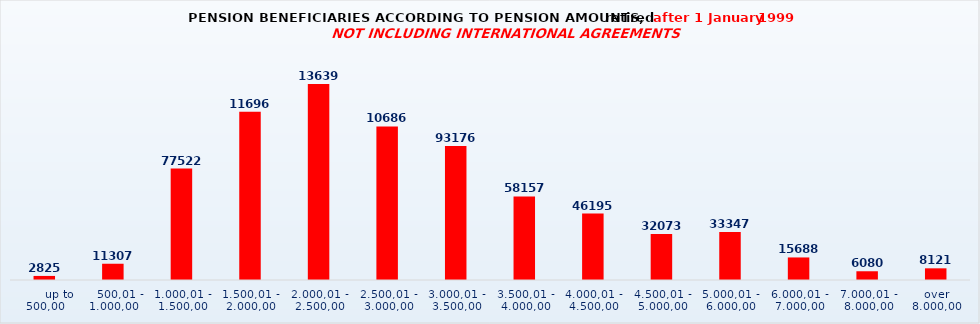
| Category | Series 0 |
|---|---|
|       up to 500,00 | 2825 |
|    500,01 - 1.000,00 | 11307 |
| 1.000,01 - 1.500,00 | 77522 |
| 1.500,01 - 2.000,00 | 116964 |
| 2.000,01 - 2.500,00 | 136396 |
| 2.500,01 - 3.000,00 | 106862 |
| 3.000,01 - 3.500,00 | 93176 |
| 3.500,01 - 4.000,00 | 58157 |
| 4.000,01 - 4.500,00 | 46195 |
| 4.500,01 - 5.000,00 | 32073 |
| 5.000,01 - 6.000,00 | 33347 |
| 6.000,01 - 7.000,00 | 15688 |
| 7.000,01 - 8.000,00 | 6080 |
| over 8.000,00 | 8121 |